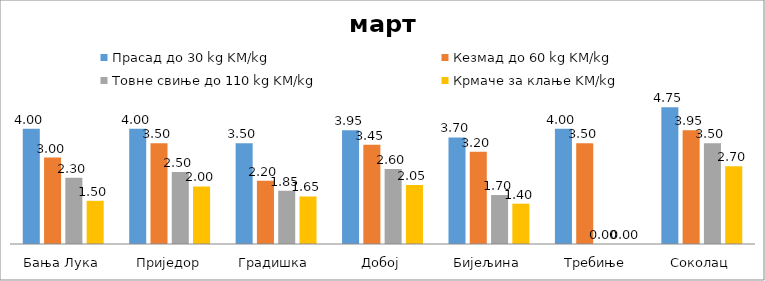
| Category | Прасад до 30 kg KM/kg | Кезмад до 60 kg KM/kg | Товне свиње до 110 kg KM/kg | Крмаче за клање KM/kg |
|---|---|---|---|---|
| Бања Лука | 4 | 3 | 2.3 | 1.5 |
| Приједор | 4 | 3.5 | 2.5 | 2 |
| Градишка | 3.5 | 2.2 | 1.85 | 1.65 |
| Добој | 3.95 | 3.45 | 2.6 | 2.05 |
| Бијељина | 3.7 | 3.2 | 1.7 | 1.4 |
|  Требиње | 4 | 3.5 | 0 | 0 |
| Соколац | 4.75 | 3.95 | 3.5 | 2.7 |